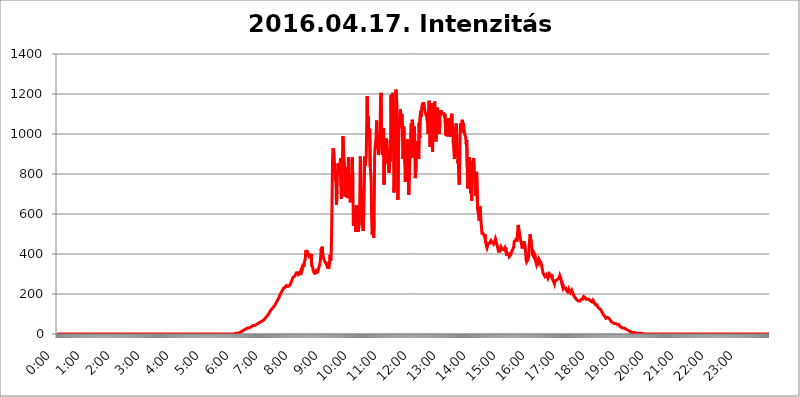
| Category | 2016.04.17. Intenzitás [W/m^2] |
|---|---|
| 0.0 | 0 |
| 0.0006944444444444445 | 0 |
| 0.001388888888888889 | 0 |
| 0.0020833333333333333 | 0 |
| 0.002777777777777778 | 0 |
| 0.003472222222222222 | 0 |
| 0.004166666666666667 | 0 |
| 0.004861111111111111 | 0 |
| 0.005555555555555556 | 0 |
| 0.0062499999999999995 | 0 |
| 0.006944444444444444 | 0 |
| 0.007638888888888889 | 0 |
| 0.008333333333333333 | 0 |
| 0.009027777777777779 | 0 |
| 0.009722222222222222 | 0 |
| 0.010416666666666666 | 0 |
| 0.011111111111111112 | 0 |
| 0.011805555555555555 | 0 |
| 0.012499999999999999 | 0 |
| 0.013194444444444444 | 0 |
| 0.013888888888888888 | 0 |
| 0.014583333333333332 | 0 |
| 0.015277777777777777 | 0 |
| 0.015972222222222224 | 0 |
| 0.016666666666666666 | 0 |
| 0.017361111111111112 | 0 |
| 0.018055555555555557 | 0 |
| 0.01875 | 0 |
| 0.019444444444444445 | 0 |
| 0.02013888888888889 | 0 |
| 0.020833333333333332 | 0 |
| 0.02152777777777778 | 0 |
| 0.022222222222222223 | 0 |
| 0.02291666666666667 | 0 |
| 0.02361111111111111 | 0 |
| 0.024305555555555556 | 0 |
| 0.024999999999999998 | 0 |
| 0.025694444444444447 | 0 |
| 0.02638888888888889 | 0 |
| 0.027083333333333334 | 0 |
| 0.027777777777777776 | 0 |
| 0.02847222222222222 | 0 |
| 0.029166666666666664 | 0 |
| 0.029861111111111113 | 0 |
| 0.030555555555555555 | 0 |
| 0.03125 | 0 |
| 0.03194444444444445 | 0 |
| 0.03263888888888889 | 0 |
| 0.03333333333333333 | 0 |
| 0.034027777777777775 | 0 |
| 0.034722222222222224 | 0 |
| 0.035416666666666666 | 0 |
| 0.036111111111111115 | 0 |
| 0.03680555555555556 | 0 |
| 0.0375 | 0 |
| 0.03819444444444444 | 0 |
| 0.03888888888888889 | 0 |
| 0.03958333333333333 | 0 |
| 0.04027777777777778 | 0 |
| 0.04097222222222222 | 0 |
| 0.041666666666666664 | 0 |
| 0.042361111111111106 | 0 |
| 0.04305555555555556 | 0 |
| 0.043750000000000004 | 0 |
| 0.044444444444444446 | 0 |
| 0.04513888888888889 | 0 |
| 0.04583333333333334 | 0 |
| 0.04652777777777778 | 0 |
| 0.04722222222222222 | 0 |
| 0.04791666666666666 | 0 |
| 0.04861111111111111 | 0 |
| 0.049305555555555554 | 0 |
| 0.049999999999999996 | 0 |
| 0.05069444444444445 | 0 |
| 0.051388888888888894 | 0 |
| 0.052083333333333336 | 0 |
| 0.05277777777777778 | 0 |
| 0.05347222222222222 | 0 |
| 0.05416666666666667 | 0 |
| 0.05486111111111111 | 0 |
| 0.05555555555555555 | 0 |
| 0.05625 | 0 |
| 0.05694444444444444 | 0 |
| 0.057638888888888885 | 0 |
| 0.05833333333333333 | 0 |
| 0.05902777777777778 | 0 |
| 0.059722222222222225 | 0 |
| 0.06041666666666667 | 0 |
| 0.061111111111111116 | 0 |
| 0.06180555555555556 | 0 |
| 0.0625 | 0 |
| 0.06319444444444444 | 0 |
| 0.06388888888888888 | 0 |
| 0.06458333333333334 | 0 |
| 0.06527777777777778 | 0 |
| 0.06597222222222222 | 0 |
| 0.06666666666666667 | 0 |
| 0.06736111111111111 | 0 |
| 0.06805555555555555 | 0 |
| 0.06874999999999999 | 0 |
| 0.06944444444444443 | 0 |
| 0.07013888888888889 | 0 |
| 0.07083333333333333 | 0 |
| 0.07152777777777779 | 0 |
| 0.07222222222222223 | 0 |
| 0.07291666666666667 | 0 |
| 0.07361111111111111 | 0 |
| 0.07430555555555556 | 0 |
| 0.075 | 0 |
| 0.07569444444444444 | 0 |
| 0.0763888888888889 | 0 |
| 0.07708333333333334 | 0 |
| 0.07777777777777778 | 0 |
| 0.07847222222222222 | 0 |
| 0.07916666666666666 | 0 |
| 0.0798611111111111 | 0 |
| 0.08055555555555556 | 0 |
| 0.08125 | 0 |
| 0.08194444444444444 | 0 |
| 0.08263888888888889 | 0 |
| 0.08333333333333333 | 0 |
| 0.08402777777777777 | 0 |
| 0.08472222222222221 | 0 |
| 0.08541666666666665 | 0 |
| 0.08611111111111112 | 0 |
| 0.08680555555555557 | 0 |
| 0.08750000000000001 | 0 |
| 0.08819444444444445 | 0 |
| 0.08888888888888889 | 0 |
| 0.08958333333333333 | 0 |
| 0.09027777777777778 | 0 |
| 0.09097222222222222 | 0 |
| 0.09166666666666667 | 0 |
| 0.09236111111111112 | 0 |
| 0.09305555555555556 | 0 |
| 0.09375 | 0 |
| 0.09444444444444444 | 0 |
| 0.09513888888888888 | 0 |
| 0.09583333333333333 | 0 |
| 0.09652777777777777 | 0 |
| 0.09722222222222222 | 0 |
| 0.09791666666666667 | 0 |
| 0.09861111111111111 | 0 |
| 0.09930555555555555 | 0 |
| 0.09999999999999999 | 0 |
| 0.10069444444444443 | 0 |
| 0.1013888888888889 | 0 |
| 0.10208333333333335 | 0 |
| 0.10277777777777779 | 0 |
| 0.10347222222222223 | 0 |
| 0.10416666666666667 | 0 |
| 0.10486111111111111 | 0 |
| 0.10555555555555556 | 0 |
| 0.10625 | 0 |
| 0.10694444444444444 | 0 |
| 0.1076388888888889 | 0 |
| 0.10833333333333334 | 0 |
| 0.10902777777777778 | 0 |
| 0.10972222222222222 | 0 |
| 0.1111111111111111 | 0 |
| 0.11180555555555556 | 0 |
| 0.11180555555555556 | 0 |
| 0.1125 | 0 |
| 0.11319444444444444 | 0 |
| 0.11388888888888889 | 0 |
| 0.11458333333333333 | 0 |
| 0.11527777777777777 | 0 |
| 0.11597222222222221 | 0 |
| 0.11666666666666665 | 0 |
| 0.1173611111111111 | 0 |
| 0.11805555555555557 | 0 |
| 0.11944444444444445 | 0 |
| 0.12013888888888889 | 0 |
| 0.12083333333333333 | 0 |
| 0.12152777777777778 | 0 |
| 0.12222222222222223 | 0 |
| 0.12291666666666667 | 0 |
| 0.12291666666666667 | 0 |
| 0.12361111111111112 | 0 |
| 0.12430555555555556 | 0 |
| 0.125 | 0 |
| 0.12569444444444444 | 0 |
| 0.12638888888888888 | 0 |
| 0.12708333333333333 | 0 |
| 0.16875 | 0 |
| 0.12847222222222224 | 0 |
| 0.12916666666666668 | 0 |
| 0.12986111111111112 | 0 |
| 0.13055555555555556 | 0 |
| 0.13125 | 0 |
| 0.13194444444444445 | 0 |
| 0.1326388888888889 | 0 |
| 0.13333333333333333 | 0 |
| 0.13402777777777777 | 0 |
| 0.13402777777777777 | 0 |
| 0.13472222222222222 | 0 |
| 0.13541666666666666 | 0 |
| 0.1361111111111111 | 0 |
| 0.13749999999999998 | 0 |
| 0.13819444444444443 | 0 |
| 0.1388888888888889 | 0 |
| 0.13958333333333334 | 0 |
| 0.14027777777777778 | 0 |
| 0.14097222222222222 | 0 |
| 0.14166666666666666 | 0 |
| 0.1423611111111111 | 0 |
| 0.14305555555555557 | 0 |
| 0.14375000000000002 | 0 |
| 0.14444444444444446 | 0 |
| 0.1451388888888889 | 0 |
| 0.1451388888888889 | 0 |
| 0.14652777777777778 | 0 |
| 0.14722222222222223 | 0 |
| 0.14791666666666667 | 0 |
| 0.1486111111111111 | 0 |
| 0.14930555555555555 | 0 |
| 0.15 | 0 |
| 0.15069444444444444 | 0 |
| 0.15138888888888888 | 0 |
| 0.15208333333333332 | 0 |
| 0.15277777777777776 | 0 |
| 0.15347222222222223 | 0 |
| 0.15416666666666667 | 0 |
| 0.15486111111111112 | 0 |
| 0.15555555555555556 | 0 |
| 0.15625 | 0 |
| 0.15694444444444444 | 0 |
| 0.15763888888888888 | 0 |
| 0.15833333333333333 | 0 |
| 0.15902777777777777 | 0 |
| 0.15972222222222224 | 0 |
| 0.16041666666666668 | 0 |
| 0.16111111111111112 | 0 |
| 0.16180555555555556 | 0 |
| 0.1625 | 0 |
| 0.16319444444444445 | 0 |
| 0.1638888888888889 | 0 |
| 0.16458333333333333 | 0 |
| 0.16527777777777777 | 0 |
| 0.16597222222222222 | 0 |
| 0.16666666666666666 | 0 |
| 0.1673611111111111 | 0 |
| 0.16805555555555554 | 0 |
| 0.16874999999999998 | 0 |
| 0.16944444444444443 | 0 |
| 0.17013888888888887 | 0 |
| 0.1708333333333333 | 0 |
| 0.17152777777777775 | 0 |
| 0.17222222222222225 | 0 |
| 0.1729166666666667 | 0 |
| 0.17361111111111113 | 0 |
| 0.17430555555555557 | 0 |
| 0.17500000000000002 | 0 |
| 0.17569444444444446 | 0 |
| 0.1763888888888889 | 0 |
| 0.17708333333333334 | 0 |
| 0.17777777777777778 | 0 |
| 0.17847222222222223 | 0 |
| 0.17916666666666667 | 0 |
| 0.1798611111111111 | 0 |
| 0.18055555555555555 | 0 |
| 0.18125 | 0 |
| 0.18194444444444444 | 0 |
| 0.1826388888888889 | 0 |
| 0.18333333333333335 | 0 |
| 0.1840277777777778 | 0 |
| 0.18472222222222223 | 0 |
| 0.18541666666666667 | 0 |
| 0.18611111111111112 | 0 |
| 0.18680555555555556 | 0 |
| 0.1875 | 0 |
| 0.18819444444444444 | 0 |
| 0.18888888888888888 | 0 |
| 0.18958333333333333 | 0 |
| 0.19027777777777777 | 0 |
| 0.1909722222222222 | 0 |
| 0.19166666666666665 | 0 |
| 0.19236111111111112 | 0 |
| 0.19305555555555554 | 0 |
| 0.19375 | 0 |
| 0.19444444444444445 | 0 |
| 0.1951388888888889 | 0 |
| 0.19583333333333333 | 0 |
| 0.19652777777777777 | 0 |
| 0.19722222222222222 | 0 |
| 0.19791666666666666 | 0 |
| 0.1986111111111111 | 0 |
| 0.19930555555555554 | 0 |
| 0.19999999999999998 | 0 |
| 0.20069444444444443 | 0 |
| 0.20138888888888887 | 0 |
| 0.2020833333333333 | 0 |
| 0.2027777777777778 | 0 |
| 0.2034722222222222 | 0 |
| 0.2041666666666667 | 0 |
| 0.20486111111111113 | 0 |
| 0.20555555555555557 | 0 |
| 0.20625000000000002 | 0 |
| 0.20694444444444446 | 0 |
| 0.2076388888888889 | 0 |
| 0.20833333333333334 | 0 |
| 0.20902777777777778 | 0 |
| 0.20972222222222223 | 0 |
| 0.21041666666666667 | 0 |
| 0.2111111111111111 | 0 |
| 0.21180555555555555 | 0 |
| 0.2125 | 0 |
| 0.21319444444444444 | 0 |
| 0.2138888888888889 | 0 |
| 0.21458333333333335 | 0 |
| 0.2152777777777778 | 0 |
| 0.21597222222222223 | 0 |
| 0.21666666666666667 | 0 |
| 0.21736111111111112 | 0 |
| 0.21805555555555556 | 0 |
| 0.21875 | 0 |
| 0.21944444444444444 | 0 |
| 0.22013888888888888 | 0 |
| 0.22083333333333333 | 0 |
| 0.22152777777777777 | 0 |
| 0.2222222222222222 | 0 |
| 0.22291666666666665 | 0 |
| 0.2236111111111111 | 0 |
| 0.22430555555555556 | 0 |
| 0.225 | 0 |
| 0.22569444444444445 | 0 |
| 0.2263888888888889 | 0 |
| 0.22708333333333333 | 0 |
| 0.22777777777777777 | 0 |
| 0.22847222222222222 | 0 |
| 0.22916666666666666 | 0 |
| 0.2298611111111111 | 0 |
| 0.23055555555555554 | 0 |
| 0.23124999999999998 | 0 |
| 0.23194444444444443 | 0 |
| 0.23263888888888887 | 0 |
| 0.2333333333333333 | 0 |
| 0.2340277777777778 | 0 |
| 0.2347222222222222 | 0 |
| 0.2354166666666667 | 0 |
| 0.23611111111111113 | 0 |
| 0.23680555555555557 | 3.525 |
| 0.23750000000000002 | 0 |
| 0.23819444444444446 | 0 |
| 0.2388888888888889 | 0 |
| 0.23958333333333334 | 0 |
| 0.24027777777777778 | 0 |
| 0.24097222222222223 | 0 |
| 0.24166666666666667 | 0 |
| 0.2423611111111111 | 0 |
| 0.24305555555555555 | 0 |
| 0.24375 | 0 |
| 0.24444444444444446 | 0 |
| 0.24513888888888888 | 0 |
| 0.24583333333333335 | 0 |
| 0.2465277777777778 | 0 |
| 0.24722222222222223 | 0 |
| 0.24791666666666667 | 0 |
| 0.24861111111111112 | 0 |
| 0.24930555555555556 | 0 |
| 0.25 | 3.525 |
| 0.25069444444444444 | 3.525 |
| 0.2513888888888889 | 3.525 |
| 0.2520833333333333 | 3.525 |
| 0.25277777777777777 | 3.525 |
| 0.2534722222222222 | 3.525 |
| 0.25416666666666665 | 3.525 |
| 0.2548611111111111 | 7.887 |
| 0.2555555555555556 | 7.887 |
| 0.25625000000000003 | 7.887 |
| 0.2569444444444445 | 7.887 |
| 0.2576388888888889 | 12.257 |
| 0.25833333333333336 | 12.257 |
| 0.2590277777777778 | 12.257 |
| 0.25972222222222224 | 12.257 |
| 0.2604166666666667 | 16.636 |
| 0.2611111111111111 | 16.636 |
| 0.26180555555555557 | 16.636 |
| 0.2625 | 21.024 |
| 0.26319444444444445 | 21.024 |
| 0.2638888888888889 | 21.024 |
| 0.26458333333333334 | 25.419 |
| 0.2652777777777778 | 25.419 |
| 0.2659722222222222 | 25.419 |
| 0.26666666666666666 | 29.823 |
| 0.2673611111111111 | 29.823 |
| 0.26805555555555555 | 29.823 |
| 0.26875 | 29.823 |
| 0.26944444444444443 | 29.823 |
| 0.2701388888888889 | 34.234 |
| 0.2708333333333333 | 34.234 |
| 0.27152777777777776 | 34.234 |
| 0.2722222222222222 | 38.653 |
| 0.27291666666666664 | 38.653 |
| 0.2736111111111111 | 38.653 |
| 0.2743055555555555 | 38.653 |
| 0.27499999999999997 | 43.079 |
| 0.27569444444444446 | 43.079 |
| 0.27638888888888885 | 43.079 |
| 0.27708333333333335 | 43.079 |
| 0.2777777777777778 | 47.511 |
| 0.27847222222222223 | 47.511 |
| 0.2791666666666667 | 47.511 |
| 0.2798611111111111 | 47.511 |
| 0.28055555555555556 | 47.511 |
| 0.28125 | 51.951 |
| 0.28194444444444444 | 51.951 |
| 0.2826388888888889 | 51.951 |
| 0.2833333333333333 | 56.398 |
| 0.28402777777777777 | 56.398 |
| 0.2847222222222222 | 56.398 |
| 0.28541666666666665 | 60.85 |
| 0.28611111111111115 | 60.85 |
| 0.28680555555555554 | 60.85 |
| 0.28750000000000003 | 65.31 |
| 0.2881944444444445 | 65.31 |
| 0.2888888888888889 | 69.775 |
| 0.28958333333333336 | 69.775 |
| 0.2902777777777778 | 74.246 |
| 0.29097222222222224 | 74.246 |
| 0.2916666666666667 | 78.722 |
| 0.2923611111111111 | 83.205 |
| 0.29305555555555557 | 83.205 |
| 0.29375 | 87.692 |
| 0.29444444444444445 | 92.184 |
| 0.2951388888888889 | 92.184 |
| 0.29583333333333334 | 96.682 |
| 0.2965277777777778 | 101.184 |
| 0.2972222222222222 | 105.69 |
| 0.29791666666666666 | 110.201 |
| 0.2986111111111111 | 114.716 |
| 0.29930555555555555 | 119.235 |
| 0.3 | 119.235 |
| 0.30069444444444443 | 123.758 |
| 0.3013888888888889 | 128.284 |
| 0.3020833333333333 | 128.284 |
| 0.30277777777777776 | 132.814 |
| 0.3034722222222222 | 137.347 |
| 0.30416666666666664 | 137.347 |
| 0.3048611111111111 | 141.884 |
| 0.3055555555555555 | 141.884 |
| 0.30624999999999997 | 146.423 |
| 0.3069444444444444 | 155.509 |
| 0.3076388888888889 | 160.056 |
| 0.30833333333333335 | 164.605 |
| 0.3090277777777778 | 169.156 |
| 0.30972222222222223 | 173.709 |
| 0.3104166666666667 | 178.264 |
| 0.3111111111111111 | 182.82 |
| 0.31180555555555556 | 191.937 |
| 0.3125 | 196.497 |
| 0.31319444444444444 | 201.058 |
| 0.3138888888888889 | 205.62 |
| 0.3145833333333333 | 210.182 |
| 0.31527777777777777 | 214.746 |
| 0.3159722222222222 | 219.309 |
| 0.31666666666666665 | 223.873 |
| 0.31736111111111115 | 228.436 |
| 0.31805555555555554 | 233 |
| 0.31875000000000003 | 233 |
| 0.3194444444444445 | 233 |
| 0.3201388888888889 | 237.564 |
| 0.32083333333333336 | 237.564 |
| 0.3215277777777778 | 242.127 |
| 0.32222222222222224 | 237.564 |
| 0.3229166666666667 | 237.564 |
| 0.3236111111111111 | 237.564 |
| 0.32430555555555557 | 237.564 |
| 0.325 | 242.127 |
| 0.32569444444444445 | 242.127 |
| 0.3263888888888889 | 242.127 |
| 0.32708333333333334 | 246.689 |
| 0.3277777777777778 | 255.813 |
| 0.3284722222222222 | 260.373 |
| 0.32916666666666666 | 269.49 |
| 0.3298611111111111 | 274.047 |
| 0.33055555555555555 | 283.156 |
| 0.33125 | 283.156 |
| 0.33194444444444443 | 283.156 |
| 0.3326388888888889 | 287.709 |
| 0.3333333333333333 | 292.259 |
| 0.3340277777777778 | 296.808 |
| 0.3347222222222222 | 296.808 |
| 0.3354166666666667 | 305.898 |
| 0.3361111111111111 | 301.354 |
| 0.3368055555555556 | 305.898 |
| 0.33749999999999997 | 305.898 |
| 0.33819444444444446 | 296.808 |
| 0.33888888888888885 | 301.354 |
| 0.33958333333333335 | 301.354 |
| 0.34027777777777773 | 301.354 |
| 0.34097222222222223 | 310.44 |
| 0.3416666666666666 | 310.44 |
| 0.3423611111111111 | 324.052 |
| 0.3430555555555555 | 314.98 |
| 0.34375 | 319.517 |
| 0.3444444444444445 | 333.113 |
| 0.3451388888888889 | 351.198 |
| 0.3458333333333334 | 337.639 |
| 0.34652777777777777 | 355.712 |
| 0.34722222222222227 | 351.198 |
| 0.34791666666666665 | 378.224 |
| 0.34861111111111115 | 418.492 |
| 0.34930555555555554 | 409.574 |
| 0.35000000000000003 | 418.492 |
| 0.3506944444444444 | 387.202 |
| 0.3513888888888889 | 405.108 |
| 0.3520833333333333 | 405.108 |
| 0.3527777777777778 | 405.108 |
| 0.3534722222222222 | 391.685 |
| 0.3541666666666667 | 378.224 |
| 0.3548611111111111 | 382.715 |
| 0.35555555555555557 | 373.729 |
| 0.35625 | 400.638 |
| 0.35694444444444445 | 342.162 |
| 0.3576388888888889 | 346.682 |
| 0.35833333333333334 | 333.113 |
| 0.3590277777777778 | 314.98 |
| 0.3597222222222222 | 314.98 |
| 0.36041666666666666 | 305.898 |
| 0.3611111111111111 | 305.898 |
| 0.36180555555555555 | 305.898 |
| 0.3625 | 314.98 |
| 0.36319444444444443 | 305.898 |
| 0.3638888888888889 | 305.898 |
| 0.3645833333333333 | 305.898 |
| 0.3652777777777778 | 310.44 |
| 0.3659722222222222 | 319.517 |
| 0.3666666666666667 | 328.584 |
| 0.3673611111111111 | 337.639 |
| 0.3680555555555556 | 346.682 |
| 0.36874999999999997 | 360.221 |
| 0.36944444444444446 | 387.202 |
| 0.37013888888888885 | 427.39 |
| 0.37083333333333335 | 405.108 |
| 0.37152777777777773 | 436.27 |
| 0.37222222222222223 | 409.574 |
| 0.3729166666666666 | 391.685 |
| 0.3736111111111111 | 378.224 |
| 0.3743055555555555 | 373.729 |
| 0.375 | 364.728 |
| 0.3756944444444445 | 364.728 |
| 0.3763888888888889 | 360.221 |
| 0.3770833333333334 | 351.198 |
| 0.37777777777777777 | 360.221 |
| 0.37847222222222227 | 342.162 |
| 0.37916666666666665 | 333.113 |
| 0.37986111111111115 | 333.113 |
| 0.38055555555555554 | 333.113 |
| 0.38125000000000003 | 333.113 |
| 0.3819444444444444 | 360.221 |
| 0.3826388888888889 | 396.164 |
| 0.3833333333333333 | 364.728 |
| 0.3840277777777778 | 378.224 |
| 0.3847222222222222 | 480.356 |
| 0.3854166666666667 | 675.311 |
| 0.3861111111111111 | 868.305 |
| 0.38680555555555557 | 928.819 |
| 0.3875 | 917.534 |
| 0.38819444444444445 | 894.885 |
| 0.3888888888888889 | 894.885 |
| 0.38958333333333334 | 802.868 |
| 0.3902777777777778 | 767.62 |
| 0.3909722222222222 | 759.723 |
| 0.39166666666666666 | 646.537 |
| 0.3923611111111111 | 715.858 |
| 0.39305555555555555 | 810.641 |
| 0.39375 | 853.029 |
| 0.39444444444444443 | 833.834 |
| 0.3951388888888889 | 818.392 |
| 0.3958333333333333 | 829.981 |
| 0.3965277777777778 | 841.526 |
| 0.3972222222222222 | 879.719 |
| 0.3979166666666667 | 735.89 |
| 0.3986111111111111 | 675.311 |
| 0.3993055555555556 | 841.526 |
| 0.39999999999999997 | 879.719 |
| 0.40069444444444446 | 988.714 |
| 0.40138888888888885 | 932.576 |
| 0.40208333333333335 | 887.309 |
| 0.40277777777777773 | 853.029 |
| 0.40347222222222223 | 687.544 |
| 0.4041666666666666 | 822.26 |
| 0.4048611111111111 | 833.834 |
| 0.4055555555555555 | 798.974 |
| 0.40625 | 798.974 |
| 0.4069444444444445 | 679.395 |
| 0.4076388888888889 | 735.89 |
| 0.4083333333333334 | 883.516 |
| 0.40902777777777777 | 860.676 |
| 0.40972222222222227 | 703.762 |
| 0.41041666666666665 | 755.766 |
| 0.41111111111111115 | 658.909 |
| 0.41180555555555554 | 798.974 |
| 0.41250000000000003 | 743.859 |
| 0.4131944444444444 | 775.492 |
| 0.4138888888888889 | 883.516 |
| 0.4145833333333333 | 747.834 |
| 0.4152777777777778 | 541.121 |
| 0.4159722222222222 | 553.986 |
| 0.4166666666666667 | 600.661 |
| 0.4173611111111111 | 621.613 |
| 0.41805555555555557 | 541.121 |
| 0.41875 | 510.885 |
| 0.41944444444444445 | 642.4 |
| 0.4201388888888889 | 642.4 |
| 0.42083333333333334 | 558.261 |
| 0.4215277777777778 | 523.88 |
| 0.4222222222222222 | 510.885 |
| 0.42291666666666666 | 515.223 |
| 0.4236111111111111 | 562.53 |
| 0.42430555555555555 | 679.395 |
| 0.425 | 887.309 |
| 0.42569444444444443 | 856.855 |
| 0.4263888888888889 | 687.544 |
| 0.4270833333333333 | 723.889 |
| 0.4277777777777778 | 558.261 |
| 0.4284722222222222 | 536.82 |
| 0.4291666666666667 | 515.223 |
| 0.4298611111111111 | 604.864 |
| 0.4305555555555556 | 731.896 |
| 0.43124999999999997 | 887.309 |
| 0.43194444444444446 | 841.526 |
| 0.43263888888888885 | 868.305 |
| 0.43333333333333335 | 887.309 |
| 0.43402777777777773 | 1041.019 |
| 0.43472222222222223 | 1189.969 |
| 0.4354166666666666 | 981.244 |
| 0.4361111111111111 | 1089.873 |
| 0.4368055555555555 | 984.98 |
| 0.4375 | 1011.118 |
| 0.4381944444444445 | 1026.06 |
| 0.4388888888888889 | 837.682 |
| 0.4395833333333334 | 810.641 |
| 0.44027777777777777 | 763.674 |
| 0.44097222222222227 | 579.542 |
| 0.44166666666666665 | 497.836 |
| 0.44236111111111115 | 528.2 |
| 0.44305555555555554 | 588.009 |
| 0.44375000000000003 | 480.356 |
| 0.4444444444444444 | 562.53 |
| 0.4451388888888889 | 879.719 |
| 0.4458333333333333 | 936.33 |
| 0.4465277777777778 | 955.071 |
| 0.4472222222222222 | 992.448 |
| 0.4479166666666667 | 1067.267 |
| 0.4486111111111111 | 925.06 |
| 0.44930555555555557 | 977.508 |
| 0.45 | 947.58 |
| 0.45069444444444445 | 894.885 |
| 0.4513888888888889 | 891.099 |
| 0.45208333333333334 | 992.448 |
| 0.4527777777777778 | 1026.06 |
| 0.4534722222222222 | 1174.263 |
| 0.45416666666666666 | 1205.82 |
| 0.4548611111111111 | 996.182 |
| 0.45555555555555555 | 909.996 |
| 0.45625 | 894.885 |
| 0.45694444444444443 | 1014.852 |
| 0.4576388888888889 | 1029.798 |
| 0.4583333333333333 | 747.834 |
| 0.4590277777777778 | 833.834 |
| 0.4597222222222222 | 875.918 |
| 0.4604166666666667 | 879.719 |
| 0.4611111111111111 | 966.295 |
| 0.4618055555555556 | 977.508 |
| 0.46249999999999997 | 955.071 |
| 0.46319444444444446 | 917.534 |
| 0.46388888888888885 | 849.199 |
| 0.46458333333333335 | 925.06 |
| 0.46527777777777773 | 806.757 |
| 0.46597222222222223 | 894.885 |
| 0.4666666666666666 | 860.676 |
| 0.4673611111111111 | 894.885 |
| 0.4680555555555555 | 1193.918 |
| 0.46875 | 1022.323 |
| 0.4694444444444445 | 1178.177 |
| 0.4701388888888889 | 1205.82 |
| 0.4708333333333334 | 1170.358 |
| 0.47152777777777777 | 970.034 |
| 0.47222222222222227 | 707.8 |
| 0.47291666666666665 | 775.492 |
| 0.47361111111111115 | 1044.762 |
| 0.47430555555555554 | 1089.873 |
| 0.47500000000000003 | 1221.83 |
| 0.4756944444444444 | 1189.969 |
| 0.4763888888888889 | 1147.086 |
| 0.4770833333333333 | 977.508 |
| 0.4777777777777778 | 671.22 |
| 0.4784722222222222 | 883.516 |
| 0.4791666666666667 | 1018.587 |
| 0.4798611111111111 | 1033.537 |
| 0.48055555555555557 | 1105.019 |
| 0.48125 | 1124.056 |
| 0.48194444444444445 | 1067.267 |
| 0.4826388888888889 | 1078.555 |
| 0.48333333333333334 | 1101.226 |
| 0.4840277777777778 | 1041.019 |
| 0.4847222222222222 | 875.918 |
| 0.48541666666666666 | 902.447 |
| 0.4861111111111111 | 1037.277 |
| 0.48680555555555555 | 875.918 |
| 0.4875 | 849.199 |
| 0.48819444444444443 | 759.723 |
| 0.4888888888888889 | 936.33 |
| 0.4895833333333333 | 791.169 |
| 0.4902777777777778 | 791.169 |
| 0.4909722222222222 | 973.772 |
| 0.4916666666666667 | 841.526 |
| 0.4923611111111111 | 787.258 |
| 0.4930555555555556 | 695.666 |
| 0.49374999999999997 | 806.757 |
| 0.49444444444444446 | 853.029 |
| 0.49513888888888885 | 909.996 |
| 0.49583333333333335 | 1003.65 |
| 0.49652777777777773 | 1052.255 |
| 0.49722222222222223 | 879.719 |
| 0.4979166666666666 | 1071.027 |
| 0.4986111111111111 | 1048.508 |
| 0.4993055555555555 | 887.309 |
| 0.5 | 943.832 |
| 0.5006944444444444 | 1037.277 |
| 0.5013888888888889 | 984.98 |
| 0.5020833333333333 | 779.42 |
| 0.5027777777777778 | 775.492 |
| 0.5034722222222222 | 853.029 |
| 0.5041666666666667 | 909.996 |
| 0.5048611111111111 | 962.555 |
| 0.5055555555555555 | 917.534 |
| 0.50625 | 962.555 |
| 0.5069444444444444 | 875.918 |
| 0.5076388888888889 | 1056.004 |
| 0.5083333333333333 | 981.244 |
| 0.5090277777777777 | 1089.873 |
| 0.5097222222222222 | 1116.426 |
| 0.5104166666666666 | 1086.097 |
| 0.5111111111111112 | 1120.238 |
| 0.5118055555555555 | 1147.086 |
| 0.5125000000000001 | 1154.814 |
| 0.5131944444444444 | 1127.879 |
| 0.513888888888889 | 1158.689 |
| 0.5145833333333333 | 1139.384 |
| 0.5152777777777778 | 1139.384 |
| 0.5159722222222222 | 1108.816 |
| 0.5166666666666667 | 1108.816 |
| 0.517361111111111 | 1105.019 |
| 0.5180555555555556 | 1086.097 |
| 0.5187499999999999 | 1067.267 |
| 0.5194444444444445 | 1056.004 |
| 0.5201388888888888 | 999.916 |
| 0.5208333333333334 | 1112.618 |
| 0.5215277777777778 | 1166.46 |
| 0.5222222222222223 | 1063.51 |
| 0.5229166666666667 | 936.33 |
| 0.5236111111111111 | 1086.097 |
| 0.5243055555555556 | 1154.814 |
| 0.525 | 1029.798 |
| 0.5256944444444445 | 966.295 |
| 0.5263888888888889 | 909.996 |
| 0.5270833333333333 | 1116.426 |
| 0.5277777777777778 | 1048.508 |
| 0.5284722222222222 | 1131.708 |
| 0.5291666666666667 | 1162.571 |
| 0.5298611111111111 | 1154.814 |
| 0.5305555555555556 | 1029.798 |
| 0.53125 | 962.555 |
| 0.5319444444444444 | 1089.873 |
| 0.5326388888888889 | 1131.708 |
| 0.5333333333333333 | 1120.238 |
| 0.5340277777777778 | 1112.618 |
| 0.5347222222222222 | 1018.587 |
| 0.5354166666666667 | 1116.426 |
| 0.5361111111111111 | 999.916 |
| 0.5368055555555555 | 1112.618 |
| 0.5375 | 1116.426 |
| 0.5381944444444444 | 1108.816 |
| 0.5388888888888889 | 1112.618 |
| 0.5395833333333333 | 1108.816 |
| 0.5402777777777777 | 1101.226 |
| 0.5409722222222222 | 1101.226 |
| 0.5416666666666666 | 1097.437 |
| 0.5423611111111112 | 1101.226 |
| 0.5430555555555555 | 1093.653 |
| 0.5437500000000001 | 1101.226 |
| 0.5444444444444444 | 1097.437 |
| 0.545138888888889 | 992.448 |
| 0.5458333333333333 | 1014.852 |
| 0.5465277777777778 | 988.714 |
| 0.5472222222222222 | 999.916 |
| 0.5479166666666667 | 1056.004 |
| 0.548611111111111 | 1078.555 |
| 0.5493055555555556 | 1063.51 |
| 0.5499999999999999 | 1056.004 |
| 0.5506944444444445 | 1014.852 |
| 0.5513888888888888 | 984.98 |
| 0.5520833333333334 | 1056.004 |
| 0.5527777777777778 | 1089.873 |
| 0.5534722222222223 | 1101.226 |
| 0.5541666666666667 | 1014.852 |
| 0.5548611111111111 | 1041.019 |
| 0.5555555555555556 | 955.071 |
| 0.55625 | 951.327 |
| 0.5569444444444445 | 875.918 |
| 0.5576388888888889 | 932.576 |
| 0.5583333333333333 | 947.58 |
| 0.5590277777777778 | 1033.537 |
| 0.5597222222222222 | 1052.255 |
| 0.5604166666666667 | 962.555 |
| 0.5611111111111111 | 932.576 |
| 0.5618055555555556 | 853.029 |
| 0.5625 | 872.114 |
| 0.5631944444444444 | 868.305 |
| 0.5638888888888889 | 747.834 |
| 0.5645833333333333 | 913.766 |
| 0.5652777777777778 | 1033.537 |
| 0.5659722222222222 | 1052.255 |
| 0.5666666666666667 | 1007.383 |
| 0.5673611111111111 | 1044.762 |
| 0.5680555555555555 | 1071.027 |
| 0.56875 | 1026.06 |
| 0.5694444444444444 | 1056.004 |
| 0.5701388888888889 | 1037.277 |
| 0.5708333333333333 | 1033.537 |
| 0.5715277777777777 | 999.916 |
| 0.5722222222222222 | 996.182 |
| 0.5729166666666666 | 981.244 |
| 0.5736111111111112 | 947.58 |
| 0.5743055555555555 | 970.034 |
| 0.5750000000000001 | 837.682 |
| 0.5756944444444444 | 727.896 |
| 0.576388888888889 | 755.766 |
| 0.5770833333333333 | 798.974 |
| 0.5777777777777778 | 883.516 |
| 0.5784722222222222 | 791.169 |
| 0.5791666666666667 | 747.834 |
| 0.579861111111111 | 703.762 |
| 0.5805555555555556 | 719.877 |
| 0.5812499999999999 | 667.123 |
| 0.5819444444444445 | 856.855 |
| 0.5826388888888888 | 860.676 |
| 0.5833333333333334 | 868.305 |
| 0.5840277777777778 | 879.719 |
| 0.5847222222222223 | 814.519 |
| 0.5854166666666667 | 814.519 |
| 0.5861111111111111 | 810.641 |
| 0.5868055555555556 | 691.608 |
| 0.5875 | 802.868 |
| 0.5881944444444445 | 810.641 |
| 0.5888888888888889 | 810.641 |
| 0.5895833333333333 | 625.784 |
| 0.5902777777777778 | 629.948 |
| 0.5909722222222222 | 592.233 |
| 0.5916666666666667 | 566.793 |
| 0.5923611111111111 | 592.233 |
| 0.5930555555555556 | 638.256 |
| 0.59375 | 596.45 |
| 0.5944444444444444 | 558.261 |
| 0.5951388888888889 | 528.2 |
| 0.5958333333333333 | 497.836 |
| 0.5965277777777778 | 506.542 |
| 0.5972222222222222 | 510.885 |
| 0.5979166666666667 | 506.542 |
| 0.5986111111111111 | 493.475 |
| 0.5993055555555555 | 484.735 |
| 0.6 | 497.836 |
| 0.6006944444444444 | 458.38 |
| 0.6013888888888889 | 449.551 |
| 0.6020833333333333 | 440.702 |
| 0.6027777777777777 | 431.833 |
| 0.6034722222222222 | 440.702 |
| 0.6041666666666666 | 453.968 |
| 0.6048611111111112 | 453.968 |
| 0.6055555555555555 | 453.968 |
| 0.6062500000000001 | 453.968 |
| 0.6069444444444444 | 458.38 |
| 0.607638888888889 | 458.38 |
| 0.6083333333333333 | 467.187 |
| 0.6090277777777778 | 471.582 |
| 0.6097222222222222 | 458.38 |
| 0.6104166666666667 | 458.38 |
| 0.611111111111111 | 458.38 |
| 0.6118055555555556 | 449.551 |
| 0.6124999999999999 | 445.129 |
| 0.6131944444444445 | 453.968 |
| 0.6138888888888888 | 467.187 |
| 0.6145833333333334 | 475.972 |
| 0.6152777777777778 | 467.187 |
| 0.6159722222222223 | 462.786 |
| 0.6166666666666667 | 462.786 |
| 0.6173611111111111 | 436.27 |
| 0.6180555555555556 | 427.39 |
| 0.61875 | 414.035 |
| 0.6194444444444445 | 409.574 |
| 0.6201388888888889 | 409.574 |
| 0.6208333333333333 | 414.035 |
| 0.6215277777777778 | 427.39 |
| 0.6222222222222222 | 436.27 |
| 0.6229166666666667 | 440.702 |
| 0.6236111111111111 | 440.702 |
| 0.6243055555555556 | 422.943 |
| 0.625 | 422.943 |
| 0.6256944444444444 | 422.943 |
| 0.6263888888888889 | 422.943 |
| 0.6270833333333333 | 422.943 |
| 0.6277777777777778 | 431.833 |
| 0.6284722222222222 | 422.943 |
| 0.6291666666666667 | 431.833 |
| 0.6298611111111111 | 409.574 |
| 0.6305555555555555 | 391.685 |
| 0.63125 | 400.638 |
| 0.6319444444444444 | 405.108 |
| 0.6326388888888889 | 400.638 |
| 0.6333333333333333 | 400.638 |
| 0.6340277777777777 | 387.202 |
| 0.6347222222222222 | 382.715 |
| 0.6354166666666666 | 391.685 |
| 0.6361111111111112 | 396.164 |
| 0.6368055555555555 | 400.638 |
| 0.6375000000000001 | 414.035 |
| 0.6381944444444444 | 414.035 |
| 0.638888888888889 | 422.943 |
| 0.6395833333333333 | 422.943 |
| 0.6402777777777778 | 436.27 |
| 0.6409722222222222 | 462.786 |
| 0.6416666666666667 | 458.38 |
| 0.642361111111111 | 458.38 |
| 0.6430555555555556 | 467.187 |
| 0.6437499999999999 | 480.356 |
| 0.6444444444444445 | 462.786 |
| 0.6451388888888888 | 471.582 |
| 0.6458333333333334 | 523.88 |
| 0.6465277777777778 | 545.416 |
| 0.6472222222222223 | 528.2 |
| 0.6479166666666667 | 515.223 |
| 0.6486111111111111 | 497.836 |
| 0.6493055555555556 | 493.475 |
| 0.65 | 467.187 |
| 0.6506944444444445 | 462.786 |
| 0.6513888888888889 | 445.129 |
| 0.6520833333333333 | 427.39 |
| 0.6527777777777778 | 440.702 |
| 0.6534722222222222 | 445.129 |
| 0.6541666666666667 | 440.702 |
| 0.6548611111111111 | 462.786 |
| 0.6555555555555556 | 462.786 |
| 0.65625 | 431.833 |
| 0.6569444444444444 | 405.108 |
| 0.6576388888888889 | 369.23 |
| 0.6583333333333333 | 360.221 |
| 0.6590277777777778 | 360.221 |
| 0.6597222222222222 | 360.221 |
| 0.6604166666666667 | 373.729 |
| 0.6611111111111111 | 387.202 |
| 0.6618055555555555 | 431.833 |
| 0.6625 | 471.582 |
| 0.6631944444444444 | 497.836 |
| 0.6638888888888889 | 497.836 |
| 0.6645833333333333 | 493.475 |
| 0.6652777777777777 | 440.702 |
| 0.6659722222222222 | 414.035 |
| 0.6666666666666666 | 396.164 |
| 0.6673611111111111 | 391.685 |
| 0.6680555555555556 | 387.202 |
| 0.6687500000000001 | 405.108 |
| 0.6694444444444444 | 405.108 |
| 0.6701388888888888 | 396.164 |
| 0.6708333333333334 | 369.23 |
| 0.6715277777777778 | 355.712 |
| 0.6722222222222222 | 346.682 |
| 0.6729166666666666 | 342.162 |
| 0.6736111111111112 | 364.728 |
| 0.6743055555555556 | 364.728 |
| 0.6749999999999999 | 355.712 |
| 0.6756944444444444 | 373.729 |
| 0.6763888888888889 | 378.224 |
| 0.6770833333333334 | 364.728 |
| 0.6777777777777777 | 364.728 |
| 0.6784722222222223 | 355.712 |
| 0.6791666666666667 | 346.682 |
| 0.6798611111111111 | 342.162 |
| 0.6805555555555555 | 319.517 |
| 0.68125 | 305.898 |
| 0.6819444444444445 | 301.354 |
| 0.6826388888888889 | 296.808 |
| 0.6833333333333332 | 301.354 |
| 0.6840277777777778 | 287.709 |
| 0.6847222222222222 | 283.156 |
| 0.6854166666666667 | 283.156 |
| 0.686111111111111 | 296.808 |
| 0.6868055555555556 | 296.808 |
| 0.6875 | 292.259 |
| 0.6881944444444444 | 278.603 |
| 0.688888888888889 | 274.047 |
| 0.6895833333333333 | 292.259 |
| 0.6902777777777778 | 301.354 |
| 0.6909722222222222 | 296.808 |
| 0.6916666666666668 | 301.354 |
| 0.6923611111111111 | 292.259 |
| 0.6930555555555555 | 283.156 |
| 0.69375 | 296.808 |
| 0.6944444444444445 | 274.047 |
| 0.6951388888888889 | 269.49 |
| 0.6958333333333333 | 264.932 |
| 0.6965277777777777 | 260.373 |
| 0.6972222222222223 | 251.251 |
| 0.6979166666666666 | 264.932 |
| 0.6986111111111111 | 264.932 |
| 0.6993055555555556 | 264.932 |
| 0.7000000000000001 | 269.49 |
| 0.7006944444444444 | 264.932 |
| 0.7013888888888888 | 269.49 |
| 0.7020833333333334 | 274.047 |
| 0.7027777777777778 | 269.49 |
| 0.7034722222222222 | 274.047 |
| 0.7041666666666666 | 283.156 |
| 0.7048611111111112 | 292.259 |
| 0.7055555555555556 | 287.709 |
| 0.7062499999999999 | 278.603 |
| 0.7069444444444444 | 278.603 |
| 0.7076388888888889 | 251.251 |
| 0.7083333333333334 | 251.251 |
| 0.7090277777777777 | 233 |
| 0.7097222222222223 | 242.127 |
| 0.7104166666666667 | 237.564 |
| 0.7111111111111111 | 228.436 |
| 0.7118055555555555 | 223.873 |
| 0.7125 | 233 |
| 0.7131944444444445 | 228.436 |
| 0.7138888888888889 | 219.309 |
| 0.7145833333333332 | 214.746 |
| 0.7152777777777778 | 214.746 |
| 0.7159722222222222 | 210.182 |
| 0.7166666666666667 | 205.62 |
| 0.717361111111111 | 223.873 |
| 0.7180555555555556 | 219.309 |
| 0.71875 | 205.62 |
| 0.7194444444444444 | 219.309 |
| 0.720138888888889 | 210.182 |
| 0.7208333333333333 | 210.182 |
| 0.7215277777777778 | 219.309 |
| 0.7222222222222222 | 214.746 |
| 0.7229166666666668 | 214.746 |
| 0.7236111111111111 | 201.058 |
| 0.7243055555555555 | 196.497 |
| 0.725 | 187.378 |
| 0.7256944444444445 | 187.378 |
| 0.7263888888888889 | 182.82 |
| 0.7270833333333333 | 178.264 |
| 0.7277777777777777 | 173.709 |
| 0.7284722222222223 | 173.709 |
| 0.7291666666666666 | 169.156 |
| 0.7298611111111111 | 164.605 |
| 0.7305555555555556 | 164.605 |
| 0.7312500000000001 | 164.605 |
| 0.7319444444444444 | 164.605 |
| 0.7326388888888888 | 164.605 |
| 0.7333333333333334 | 164.605 |
| 0.7340277777777778 | 169.156 |
| 0.7347222222222222 | 173.709 |
| 0.7354166666666666 | 178.264 |
| 0.7361111111111112 | 173.709 |
| 0.7368055555555556 | 173.709 |
| 0.7374999999999999 | 178.264 |
| 0.7381944444444444 | 187.378 |
| 0.7388888888888889 | 182.82 |
| 0.7395833333333334 | 187.378 |
| 0.7402777777777777 | 182.82 |
| 0.7409722222222223 | 178.264 |
| 0.7416666666666667 | 173.709 |
| 0.7423611111111111 | 173.709 |
| 0.7430555555555555 | 178.264 |
| 0.74375 | 173.709 |
| 0.7444444444444445 | 173.709 |
| 0.7451388888888889 | 173.709 |
| 0.7458333333333332 | 173.709 |
| 0.7465277777777778 | 169.156 |
| 0.7472222222222222 | 169.156 |
| 0.7479166666666667 | 164.605 |
| 0.748611111111111 | 160.056 |
| 0.7493055555555556 | 160.056 |
| 0.75 | 160.056 |
| 0.7506944444444444 | 164.605 |
| 0.751388888888889 | 169.156 |
| 0.7520833333333333 | 164.605 |
| 0.7527777777777778 | 164.605 |
| 0.7534722222222222 | 155.509 |
| 0.7541666666666668 | 155.509 |
| 0.7548611111111111 | 146.423 |
| 0.7555555555555555 | 146.423 |
| 0.75625 | 150.964 |
| 0.7569444444444445 | 146.423 |
| 0.7576388888888889 | 137.347 |
| 0.7583333333333333 | 137.347 |
| 0.7590277777777777 | 132.814 |
| 0.7597222222222223 | 128.284 |
| 0.7604166666666666 | 128.284 |
| 0.7611111111111111 | 123.758 |
| 0.7618055555555556 | 123.758 |
| 0.7625000000000001 | 119.235 |
| 0.7631944444444444 | 114.716 |
| 0.7638888888888888 | 110.201 |
| 0.7645833333333334 | 105.69 |
| 0.7652777777777778 | 101.184 |
| 0.7659722222222222 | 96.682 |
| 0.7666666666666666 | 92.184 |
| 0.7673611111111112 | 92.184 |
| 0.7680555555555556 | 87.692 |
| 0.7687499999999999 | 83.205 |
| 0.7694444444444444 | 78.722 |
| 0.7701388888888889 | 78.722 |
| 0.7708333333333334 | 78.722 |
| 0.7715277777777777 | 83.205 |
| 0.7722222222222223 | 83.205 |
| 0.7729166666666667 | 83.205 |
| 0.7736111111111111 | 78.722 |
| 0.7743055555555555 | 74.246 |
| 0.775 | 74.246 |
| 0.7756944444444445 | 69.775 |
| 0.7763888888888889 | 65.31 |
| 0.7770833333333332 | 60.85 |
| 0.7777777777777778 | 60.85 |
| 0.7784722222222222 | 56.398 |
| 0.7791666666666667 | 56.398 |
| 0.779861111111111 | 56.398 |
| 0.7805555555555556 | 56.398 |
| 0.78125 | 51.951 |
| 0.7819444444444444 | 51.951 |
| 0.782638888888889 | 51.951 |
| 0.7833333333333333 | 51.951 |
| 0.7840277777777778 | 51.951 |
| 0.7847222222222222 | 51.951 |
| 0.7854166666666668 | 47.511 |
| 0.7861111111111111 | 47.511 |
| 0.7868055555555555 | 47.511 |
| 0.7875 | 47.511 |
| 0.7881944444444445 | 43.079 |
| 0.7888888888888889 | 38.653 |
| 0.7895833333333333 | 38.653 |
| 0.7902777777777777 | 34.234 |
| 0.7909722222222223 | 34.234 |
| 0.7916666666666666 | 34.234 |
| 0.7923611111111111 | 29.823 |
| 0.7930555555555556 | 29.823 |
| 0.7937500000000001 | 29.823 |
| 0.7944444444444444 | 29.823 |
| 0.7951388888888888 | 29.823 |
| 0.7958333333333334 | 25.419 |
| 0.7965277777777778 | 25.419 |
| 0.7972222222222222 | 25.419 |
| 0.7979166666666666 | 25.419 |
| 0.7986111111111112 | 21.024 |
| 0.7993055555555556 | 21.024 |
| 0.7999999999999999 | 21.024 |
| 0.8006944444444444 | 16.636 |
| 0.8013888888888889 | 16.636 |
| 0.8020833333333334 | 12.257 |
| 0.8027777777777777 | 12.257 |
| 0.8034722222222223 | 12.257 |
| 0.8041666666666667 | 12.257 |
| 0.8048611111111111 | 7.887 |
| 0.8055555555555555 | 7.887 |
| 0.80625 | 7.887 |
| 0.8069444444444445 | 7.887 |
| 0.8076388888888889 | 7.887 |
| 0.8083333333333332 | 7.887 |
| 0.8090277777777778 | 7.887 |
| 0.8097222222222222 | 7.887 |
| 0.8104166666666667 | 3.525 |
| 0.811111111111111 | 3.525 |
| 0.8118055555555556 | 3.525 |
| 0.8125 | 3.525 |
| 0.8131944444444444 | 3.525 |
| 0.813888888888889 | 3.525 |
| 0.8145833333333333 | 3.525 |
| 0.8152777777777778 | 3.525 |
| 0.8159722222222222 | 3.525 |
| 0.8166666666666668 | 3.525 |
| 0.8173611111111111 | 3.525 |
| 0.8180555555555555 | 3.525 |
| 0.81875 | 3.525 |
| 0.8194444444444445 | 3.525 |
| 0.8201388888888889 | 3.525 |
| 0.8208333333333333 | 0 |
| 0.8215277777777777 | 0 |
| 0.8222222222222223 | 0 |
| 0.8229166666666666 | 0 |
| 0.8236111111111111 | 0 |
| 0.8243055555555556 | 0 |
| 0.8250000000000001 | 0 |
| 0.8256944444444444 | 0 |
| 0.8263888888888888 | 0 |
| 0.8270833333333334 | 0 |
| 0.8277777777777778 | 0 |
| 0.8284722222222222 | 0 |
| 0.8291666666666666 | 0 |
| 0.8298611111111112 | 0 |
| 0.8305555555555556 | 0 |
| 0.8312499999999999 | 0 |
| 0.8319444444444444 | 0 |
| 0.8326388888888889 | 0 |
| 0.8333333333333334 | 0 |
| 0.8340277777777777 | 0 |
| 0.8347222222222223 | 0 |
| 0.8354166666666667 | 0 |
| 0.8361111111111111 | 0 |
| 0.8368055555555555 | 0 |
| 0.8375 | 0 |
| 0.8381944444444445 | 0 |
| 0.8388888888888889 | 0 |
| 0.8395833333333332 | 0 |
| 0.8402777777777778 | 0 |
| 0.8409722222222222 | 0 |
| 0.8416666666666667 | 0 |
| 0.842361111111111 | 0 |
| 0.8430555555555556 | 0 |
| 0.84375 | 0 |
| 0.8444444444444444 | 0 |
| 0.845138888888889 | 0 |
| 0.8458333333333333 | 0 |
| 0.8465277777777778 | 0 |
| 0.8472222222222222 | 0 |
| 0.8479166666666668 | 0 |
| 0.8486111111111111 | 0 |
| 0.8493055555555555 | 0 |
| 0.85 | 0 |
| 0.8506944444444445 | 0 |
| 0.8513888888888889 | 0 |
| 0.8520833333333333 | 0 |
| 0.8527777777777777 | 0 |
| 0.8534722222222223 | 0 |
| 0.8541666666666666 | 0 |
| 0.8548611111111111 | 0 |
| 0.8555555555555556 | 0 |
| 0.8562500000000001 | 0 |
| 0.8569444444444444 | 0 |
| 0.8576388888888888 | 0 |
| 0.8583333333333334 | 0 |
| 0.8590277777777778 | 0 |
| 0.8597222222222222 | 0 |
| 0.8604166666666666 | 0 |
| 0.8611111111111112 | 0 |
| 0.8618055555555556 | 0 |
| 0.8624999999999999 | 0 |
| 0.8631944444444444 | 0 |
| 0.8638888888888889 | 0 |
| 0.8645833333333334 | 0 |
| 0.8652777777777777 | 0 |
| 0.8659722222222223 | 0 |
| 0.8666666666666667 | 0 |
| 0.8673611111111111 | 0 |
| 0.8680555555555555 | 0 |
| 0.86875 | 0 |
| 0.8694444444444445 | 0 |
| 0.8701388888888889 | 0 |
| 0.8708333333333332 | 0 |
| 0.8715277777777778 | 0 |
| 0.8722222222222222 | 0 |
| 0.8729166666666667 | 0 |
| 0.873611111111111 | 0 |
| 0.8743055555555556 | 0 |
| 0.875 | 0 |
| 0.8756944444444444 | 0 |
| 0.876388888888889 | 0 |
| 0.8770833333333333 | 0 |
| 0.8777777777777778 | 0 |
| 0.8784722222222222 | 0 |
| 0.8791666666666668 | 0 |
| 0.8798611111111111 | 0 |
| 0.8805555555555555 | 0 |
| 0.88125 | 0 |
| 0.8819444444444445 | 0 |
| 0.8826388888888889 | 0 |
| 0.8833333333333333 | 0 |
| 0.8840277777777777 | 0 |
| 0.8847222222222223 | 0 |
| 0.8854166666666666 | 0 |
| 0.8861111111111111 | 0 |
| 0.8868055555555556 | 0 |
| 0.8875000000000001 | 0 |
| 0.8881944444444444 | 0 |
| 0.8888888888888888 | 0 |
| 0.8895833333333334 | 0 |
| 0.8902777777777778 | 0 |
| 0.8909722222222222 | 0 |
| 0.8916666666666666 | 0 |
| 0.8923611111111112 | 0 |
| 0.8930555555555556 | 0 |
| 0.8937499999999999 | 0 |
| 0.8944444444444444 | 0 |
| 0.8951388888888889 | 0 |
| 0.8958333333333334 | 0 |
| 0.8965277777777777 | 0 |
| 0.8972222222222223 | 0 |
| 0.8979166666666667 | 0 |
| 0.8986111111111111 | 0 |
| 0.8993055555555555 | 0 |
| 0.9 | 0 |
| 0.9006944444444445 | 0 |
| 0.9013888888888889 | 0 |
| 0.9020833333333332 | 0 |
| 0.9027777777777778 | 0 |
| 0.9034722222222222 | 0 |
| 0.9041666666666667 | 0 |
| 0.904861111111111 | 0 |
| 0.9055555555555556 | 0 |
| 0.90625 | 0 |
| 0.9069444444444444 | 0 |
| 0.907638888888889 | 0 |
| 0.9083333333333333 | 0 |
| 0.9090277777777778 | 0 |
| 0.9097222222222222 | 0 |
| 0.9104166666666668 | 0 |
| 0.9111111111111111 | 0 |
| 0.9118055555555555 | 0 |
| 0.9125 | 0 |
| 0.9131944444444445 | 0 |
| 0.9138888888888889 | 0 |
| 0.9145833333333333 | 0 |
| 0.9152777777777777 | 0 |
| 0.9159722222222223 | 0 |
| 0.9166666666666666 | 0 |
| 0.9173611111111111 | 0 |
| 0.9180555555555556 | 0 |
| 0.9187500000000001 | 0 |
| 0.9194444444444444 | 0 |
| 0.9201388888888888 | 0 |
| 0.9208333333333334 | 0 |
| 0.9215277777777778 | 0 |
| 0.9222222222222222 | 0 |
| 0.9229166666666666 | 0 |
| 0.9236111111111112 | 0 |
| 0.9243055555555556 | 0 |
| 0.9249999999999999 | 0 |
| 0.9256944444444444 | 0 |
| 0.9263888888888889 | 0 |
| 0.9270833333333334 | 0 |
| 0.9277777777777777 | 0 |
| 0.9284722222222223 | 0 |
| 0.9291666666666667 | 0 |
| 0.9298611111111111 | 0 |
| 0.9305555555555555 | 0 |
| 0.93125 | 0 |
| 0.9319444444444445 | 0 |
| 0.9326388888888889 | 0 |
| 0.9333333333333332 | 0 |
| 0.9340277777777778 | 0 |
| 0.9347222222222222 | 0 |
| 0.9354166666666667 | 0 |
| 0.936111111111111 | 0 |
| 0.9368055555555556 | 0 |
| 0.9375 | 0 |
| 0.9381944444444444 | 0 |
| 0.938888888888889 | 0 |
| 0.9395833333333333 | 0 |
| 0.9402777777777778 | 0 |
| 0.9409722222222222 | 0 |
| 0.9416666666666668 | 0 |
| 0.9423611111111111 | 0 |
| 0.9430555555555555 | 0 |
| 0.94375 | 0 |
| 0.9444444444444445 | 0 |
| 0.9451388888888889 | 0 |
| 0.9458333333333333 | 0 |
| 0.9465277777777777 | 0 |
| 0.9472222222222223 | 0 |
| 0.9479166666666666 | 0 |
| 0.9486111111111111 | 0 |
| 0.9493055555555556 | 0 |
| 0.9500000000000001 | 0 |
| 0.9506944444444444 | 0 |
| 0.9513888888888888 | 0 |
| 0.9520833333333334 | 0 |
| 0.9527777777777778 | 0 |
| 0.9534722222222222 | 0 |
| 0.9541666666666666 | 0 |
| 0.9548611111111112 | 0 |
| 0.9555555555555556 | 0 |
| 0.9562499999999999 | 0 |
| 0.9569444444444444 | 0 |
| 0.9576388888888889 | 0 |
| 0.9583333333333334 | 0 |
| 0.9590277777777777 | 0 |
| 0.9597222222222223 | 0 |
| 0.9604166666666667 | 0 |
| 0.9611111111111111 | 0 |
| 0.9618055555555555 | 0 |
| 0.9625 | 0 |
| 0.9631944444444445 | 0 |
| 0.9638888888888889 | 0 |
| 0.9645833333333332 | 0 |
| 0.9652777777777778 | 0 |
| 0.9659722222222222 | 0 |
| 0.9666666666666667 | 0 |
| 0.967361111111111 | 0 |
| 0.9680555555555556 | 0 |
| 0.96875 | 0 |
| 0.9694444444444444 | 0 |
| 0.970138888888889 | 0 |
| 0.9708333333333333 | 0 |
| 0.9715277777777778 | 0 |
| 0.9722222222222222 | 0 |
| 0.9729166666666668 | 0 |
| 0.9736111111111111 | 0 |
| 0.9743055555555555 | 0 |
| 0.975 | 0 |
| 0.9756944444444445 | 0 |
| 0.9763888888888889 | 0 |
| 0.9770833333333333 | 0 |
| 0.9777777777777777 | 0 |
| 0.9784722222222223 | 0 |
| 0.9791666666666666 | 0 |
| 0.9798611111111111 | 0 |
| 0.9805555555555556 | 0 |
| 0.9812500000000001 | 0 |
| 0.9819444444444444 | 0 |
| 0.9826388888888888 | 0 |
| 0.9833333333333334 | 0 |
| 0.9840277777777778 | 0 |
| 0.9847222222222222 | 0 |
| 0.9854166666666666 | 0 |
| 0.9861111111111112 | 0 |
| 0.9868055555555556 | 0 |
| 0.9874999999999999 | 0 |
| 0.9881944444444444 | 0 |
| 0.9888888888888889 | 0 |
| 0.9895833333333334 | 0 |
| 0.9902777777777777 | 0 |
| 0.9909722222222223 | 0 |
| 0.9916666666666667 | 0 |
| 0.9923611111111111 | 0 |
| 0.9930555555555555 | 0 |
| 0.99375 | 0 |
| 0.9944444444444445 | 0 |
| 0.9951388888888889 | 0 |
| 0.9958333333333332 | 0 |
| 0.9965277777777778 | 0 |
| 0.9972222222222222 | 0 |
| 0.9979166666666667 | 0 |
| 0.998611111111111 | 0 |
| 0.9993055555555556 | 0 |